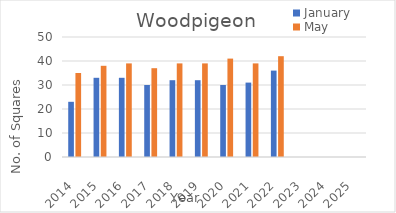
| Category | January | May |
|---|---|---|
| 2014.0 | 23 | 35 |
| 2015.0 | 33 | 38 |
| 2016.0 | 33 | 39 |
| 2017.0 | 30 | 37 |
| 2018.0 | 32 | 39 |
| 2019.0 | 32 | 39 |
| 2020.0 | 30 | 41 |
| 2021.0 | 31 | 39 |
| 2022.0 | 36 | 42 |
| 2023.0 | 0 | 0 |
| 2024.0 | 0 | 0 |
| 2025.0 | 0 | 0 |